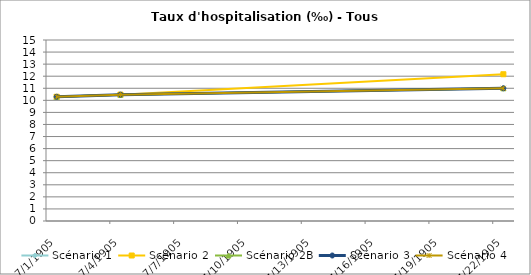
| Category | Scénario 1 | Scénario 2 | Scénario 2B | Scénario 3 | Scénario 4 |
|---|---|---|---|---|---|
| 2009.0 | 10.297 | 10.297 | 10.297 | 10.297 | 10.297 |
| 2012.0 | 10.472 | 10.472 | 10.472 | 10.472 | 10.472 |
| 2030.0 | 10.998 | 12.163 | 10.998 | 10.998 | 10.998 |